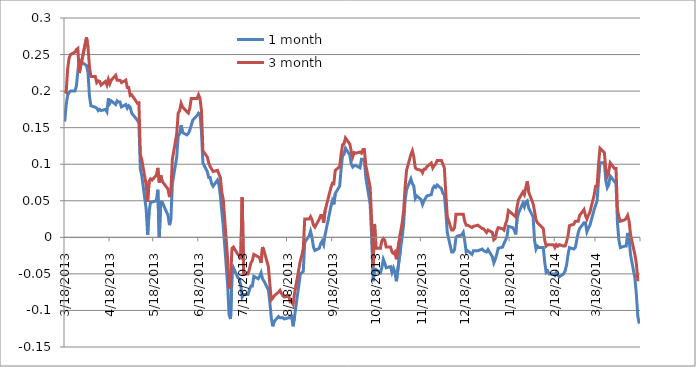
| Category | 1 month | 3 month |
|---|---|---|
| 3/18/13 | 0.158 | 0.2 |
| 3/19/13 | 0.182 | 0.198 |
| 3/20/13 | 0.194 | 0.23 |
| 3/21/13 | 0.198 | 0.245 |
| 3/22/13 | 0.2 | 0.25 |
| 3/25/13 | 0.2 | 0.253 |
| 3/26/13 | 0.207 | 0.257 |
| 3/27/13 | 0.227 | 0.258 |
| 3/28/13 | 0.242 | 0.225 |
| 4/2/13 | 0.235 | 0.273 |
| 4/3/13 | 0.225 | 0.26 |
| 4/4/13 | 0.193 | 0.233 |
| 4/5/13 | 0.18 | 0.22 |
| 4/8/13 | 0.178 | 0.22 |
| 4/9/13 | 0.177 | 0.212 |
| 4/10/13 | 0.173 | 0.214 |
| 4/11/13 | 0.175 | 0.213 |
| 4/12/13 | 0.173 | 0.208 |
| 4/15/13 | 0.175 | 0.213 |
| 4/16/13 | 0.172 | 0.208 |
| 4/17/13 | 0.19 | 0.216 |
| 4/18/13 | 0.183 | 0.21 |
| 4/19/13 | 0.187 | 0.215 |
| 4/22/13 | 0.182 | 0.222 |
| 4/23/13 | 0.187 | 0.215 |
| 4/24/13 | 0.185 | 0.215 |
| 4/25/13 | 0.185 | 0.215 |
| 4/26/13 | 0.178 | 0.212 |
| 4/29/13 | 0.182 | 0.215 |
| 4/30/13 | 0.177 | 0.205 |
| 5/1/13 | 0.18 | 0.205 |
| 5/2/13 | 0.178 | 0.194 |
| 5/3/13 | 0.17 | 0.195 |
| 5/7/13 | 0.16 | 0.183 |
| 5/8/13 | 0.156 | 0.184 |
| 5/9/13 | 0.093 | 0.113 |
| 5/10/13 | 0.084 | 0.106 |
| 5/13/13 | 0.038 | 0.072 |
| 5/14/13 | 0.003 | 0.048 |
| 5/15/13 | 0.035 | 0.077 |
| 5/16/13 | 0.048 | 0.08 |
| 5/17/13 | 0.048 | 0.078 |
| 5/20/13 | 0.05 | 0.085 |
| 5/21/13 | 0.065 | 0.095 |
| 5/22/13 | 0 | 0.075 |
| 5/23/13 | 0.048 | 0.085 |
| 5/24/13 | 0.048 | 0.077 |
| 5/28/13 | 0.03 | 0.066 |
| 5/29/13 | 0.017 | 0.055 |
| 5/30/13 | 0.025 | 0.063 |
| 5/31/13 | 0.073 | 0.107 |
| 6/3/13 | 0.11 | 0.142 |
| 6/4/13 | 0.138 | 0.17 |
| 6/5/13 | 0.142 | 0.173 |
| 6/6/13 | 0.153 | 0.183 |
| 6/7/13 | 0.143 | 0.178 |
| 6/10/13 | 0.14 | 0.172 |
| 6/11/13 | 0.142 | 0.17 |
| 6/12/13 | 0.147 | 0.177 |
| 6/13/13 | 0.153 | 0.19 |
| 6/14/13 | 0.16 | 0.19 |
| 6/17/13 | 0.167 | 0.19 |
| 6/18/13 | 0.17 | 0.195 |
| 6/19/13 | 0.168 | 0.19 |
| 6/20/13 | 0.145 | 0.173 |
| 6/21/13 | 0.102 | 0.118 |
| 6/24/13 | 0.09 | 0.11 |
| 6/25/13 | 0.082 | 0.102 |
| 6/26/13 | 0.082 | 0.097 |
| 6/27/13 | 0.073 | 0.093 |
| 6/28/13 | 0.07 | 0.09 |
| 7/1/13 | 0.078 | 0.092 |
| 7/2/13 | 0.072 | 0.087 |
| 7/3/13 | 0.057 | 0.082 |
| 7/4/13 | 0.035 | 0.062 |
| 7/5/13 | 0.015 | 0.052 |
| 7/8/13 | -0.065 | -0.03 |
| 7/9/13 | -0.106 | -0.07 |
| 7/10/13 | -0.112 | -0.058 |
| 7/11/13 | -0.052 | -0.015 |
| 7/12/13 | -0.042 | -0.013 |
| 7/15/13 | -0.055 | -0.023 |
| 7/16/13 | -0.057 | -0.025 |
| 7/17/13 | -0.065 | -0.03 |
| 7/18/13 | -0.082 | 0.055 |
| 7/19/13 | -0.078 | -0.05 |
| 7/22/13 | -0.078 | -0.05 |
| 7/23/13 | -0.072 | -0.043 |
| 7/24/13 | -0.067 | -0.035 |
| 7/25/13 | -0.067 | -0.032 |
| 7/26/13 | -0.053 | -0.023 |
| 7/29/13 | -0.057 | -0.027 |
| 7/30/13 | -0.053 | -0.028 |
| 7/31/13 | -0.048 | -0.035 |
| 8/1/13 | -0.057 | -0.013 |
| 8/2/13 | -0.06 | -0.018 |
| 8/5/13 | -0.072 | -0.04 |
| 8/6/13 | -0.088 | -0.063 |
| 8/7/13 | -0.11 | -0.086 |
| 8/8/13 | -0.122 | -0.083 |
| 8/9/13 | -0.115 | -0.08 |
| 8/12/13 | -0.108 | -0.075 |
| 8/13/13 | -0.11 | -0.072 |
| 8/14/13 | -0.11 | -0.077 |
| 8/15/13 | -0.11 | -0.08 |
| 8/16/13 | -0.112 | -0.082 |
| 8/19/13 | -0.11 | -0.08 |
| 8/20/13 | -0.11 | -0.088 |
| 8/21/13 | -0.108 | -0.088 |
| 8/22/13 | -0.122 | -0.092 |
| 8/23/13 | -0.108 | -0.077 |
| 8/27/13 | -0.05 | -0.032 |
| 8/28/13 | -0.048 | -0.025 |
| 8/29/13 | -0.047 | -0.015 |
| 8/30/13 | -0.007 | 0.025 |
| 9/2/13 | 0.002 | 0.025 |
| 9/3/13 | 0.008 | 0.028 |
| 9/4/13 | 0 | 0.024 |
| 9/5/13 | -0.013 | 0.017 |
| 9/6/13 | -0.018 | 0.014 |
| 9/9/13 | -0.015 | 0.025 |
| 9/10/13 | -0.008 | 0.03 |
| 9/11/13 | -0.005 | 0.03 |
| 9/12/13 | -0.01 | 0.02 |
| 9/13/13 | 0.003 | 0.037 |
| 9/16/13 | 0.032 | 0.06 |
| 9/17/13 | 0.042 | 0.068 |
| 9/18/13 | 0.05 | 0.074 |
| 9/19/13 | 0.045 | 0.073 |
| 9/20/13 | 0.06 | 0.092 |
| 9/23/13 | 0.07 | 0.097 |
| 9/24/13 | 0.093 | 0.113 |
| 9/25/13 | 0.112 | 0.127 |
| 9/26/13 | 0.113 | 0.128 |
| 9/27/13 | 0.122 | 0.136 |
| 9/30/13 | 0.112 | 0.128 |
| 10/1/13 | 0.1 | 0.118 |
| 10/2/13 | 0.096 | 0.11 |
| 10/3/13 | 0.098 | 0.116 |
| 10/4/13 | 0.098 | 0.115 |
| 10/7/13 | 0.095 | 0.117 |
| 10/8/13 | 0.107 | 0.115 |
| 10/9/13 | 0.107 | 0.12 |
| 10/10/13 | 0.105 | 0.12 |
| 10/11/13 | 0.082 | 0.098 |
| 10/14/13 | 0.045 | 0.068 |
| 10/15/13 | 0 | 0.023 |
| 10/16/13 | -0.06 | -0.04 |
| 10/17/13 | -0.043 | 0.018 |
| 10/18/13 | -0.044 | -0.015 |
| 10/21/13 | -0.048 | -0.015 |
| 10/22/13 | -0.042 | -0.005 |
| 10/23/13 | -0.03 | -0.002 |
| 10/24/13 | -0.035 | -0.004 |
| 10/25/13 | -0.042 | -0.013 |
| 10/28/13 | -0.04 | -0.013 |
| 10/29/13 | -0.048 | -0.02 |
| 10/30/13 | -0.042 | -0.022 |
| 10/31/13 | -0.048 | -0.02 |
| 11/1/13 | -0.06 | -0.03 |
| 11/4/13 | -0.013 | 0.008 |
| 11/5/13 | 0 | 0.02 |
| 11/6/13 | 0.018 | 0.037 |
| 11/7/13 | 0.05 | 0.068 |
| 11/8/13 | 0.065 | 0.092 |
| 11/11/13 | 0.08 | 0.113 |
| 11/12/13 | 0.073 | 0.118 |
| 11/13/13 | 0.07 | 0.11 |
| 11/14/13 | 0.053 | 0.095 |
| 11/15/13 | 0.057 | 0.093 |
| 11/18/13 | 0.052 | 0.092 |
| 11/19/13 | 0.045 | 0.088 |
| 11/20/13 | 0.05 | 0.093 |
| 11/21/13 | 0.053 | 0.093 |
| 11/22/13 | 0.057 | 0.097 |
| 11/25/13 | 0.058 | 0.102 |
| 11/26/13 | 0.067 | 0.095 |
| 11/27/13 | 0.07 | 0.098 |
| 11/28/13 | 0.068 | 0.1 |
| 11/29/13 | 0.072 | 0.105 |
| 12/2/13 | 0.067 | 0.105 |
| 12/3/13 | 0.06 | 0.1 |
| 12/4/13 | 0.058 | 0.095 |
| 12/5/13 | 0.035 | 0.06 |
| 12/6/13 | 0.007 | 0.028 |
| 12/9/13 | -0.02 | 0.01 |
| 12/10/13 | -0.02 | 0.01 |
| 12/11/13 | -0.017 | 0.013 |
| 12/12/13 | 0 | 0.032 |
| 12/13/13 | 0.002 | 0.032 |
| 12/16/13 | 0.003 | 0.032 |
| 12/17/13 | 0.007 | 0.032 |
| 12/18/13 | -0.005 | 0.022 |
| 12/19/13 | -0.02 | 0.017 |
| 12/20/13 | -0.018 | 0.017 |
| 12/23/13 | -0.023 | 0.013 |
| 12/24/13 | -0.018 | 0.015 |
| 12/27/13 | -0.018 | 0.017 |
| 12/30/13 | -0.016 | 0.012 |
| 12/31/13 | -0.018 | 0.012 |
| 1/2/14 | -0.02 | 0.007 |
| 1/3/14 | -0.017 | 0.01 |
| 1/6/14 | -0.027 | 0.007 |
| 1/7/14 | -0.035 | -0.003 |
| 1/8/14 | -0.03 | -0.002 |
| 1/9/14 | -0.023 | 0.008 |
| 1/10/14 | -0.015 | 0.013 |
| 1/13/14 | -0.013 | 0.012 |
| 1/14/14 | -0.008 | 0.01 |
| 1/15/14 | -0.004 | 0.018 |
| 1/16/14 | 0 | 0.023 |
| 1/17/14 | 0.015 | 0.037 |
| 1/20/14 | 0.013 | 0.032 |
| 1/21/14 | 0.01 | 0.03 |
| 1/22/14 | 0.004 | 0.028 |
| 1/23/14 | 0.025 | 0.042 |
| 1/24/14 | 0.033 | 0.052 |
| 1/27/14 | 0.047 | 0.062 |
| 1/28/14 | 0.042 | 0.058 |
| 1/29/14 | 0.048 | 0.068 |
| 1/30/14 | 0.05 | 0.077 |
| 1/31/14 | 0.04 | 0.062 |
| 2/3/14 | 0.028 | 0.046 |
| 2/4/14 | -0.004 | 0.036 |
| 2/5/14 | -0.016 | 0.024 |
| 2/6/14 | -0.012 | 0.02 |
| 2/7/14 | -0.014 | 0.018 |
| 2/10/14 | -0.014 | 0.012 |
| 2/11/14 | -0.034 | -0.004 |
| 2/12/14 | -0.048 | -0.012 |
| 2/13/14 | -0.046 | -0.01 |
| 2/14/14 | -0.05 | -0.01 |
| 2/17/14 | -0.05 | -0.01 |
| 2/18/14 | -0.052 | -0.014 |
| 2/19/14 | -0.048 | -0.01 |
| 2/20/14 | -0.052 | -0.012 |
| 2/21/14 | -0.054 | -0.01 |
| 2/24/14 | -0.05 | -0.012 |
| 2/25/14 | -0.046 | -0.012 |
| 2/26/14 | -0.038 | -0.006 |
| 2/27/14 | -0.024 | 0.002 |
| 2/28/14 | -0.014 | 0.016 |
| 3/3/14 | -0.016 | 0.018 |
| 3/4/14 | -0.014 | 0.022 |
| 3/5/14 | -0.004 | 0.022 |
| 3/6/14 | 0.006 | 0.022 |
| 3/7/14 | 0.012 | 0.03 |
| 3/10/14 | 0.02 | 0.038 |
| 3/11/14 | 0.02 | 0.03 |
| 3/12/14 | 0.008 | 0.025 |
| 3/13/14 | 0.012 | 0.03 |
| 3/14/14 | 0.016 | 0.034 |
| 3/17/14 | 0.038 | 0.058 |
| 3/18/14 | 0.044 | 0.07 |
| 3/19/14 | 0.05 | 0.07 |
| 3/20/14 | 0.078 | 0.1 |
| 3/21/14 | 0.102 | 0.122 |
| 3/24/14 | 0.102 | 0.116 |
| 3/25/14 | 0.078 | 0.092 |
| 3/26/14 | 0.068 | 0.084 |
| 3/27/14 | 0.072 | 0.09 |
| 3/28/14 | 0.084 | 0.102 |
| 3/31/14 | 0.076 | 0.094 |
| 4/1/14 | 0.074 | 0.094 |
| 4/2/14 | 0.02 | 0.038 |
| 4/3/14 | -0.004 | 0.028 |
| 4/4/14 | -0.014 | 0.022 |
| 4/7/14 | -0.012 | 0.024 |
| 4/8/14 | -0.012 | 0.026 |
| 4/9/14 | 0.006 | 0.03 |
| 4/10/14 | -0.002 | 0.022 |
| 4/11/14 | -0.024 | 0.004 |
| 4/14/14 | -0.056 | -0.024 |
| 4/15/14 | -0.078 | -0.036 |
| 4/16/14 | -0.108 | -0.058 |
| 4/17/14 | -0.118 | -0.058 |